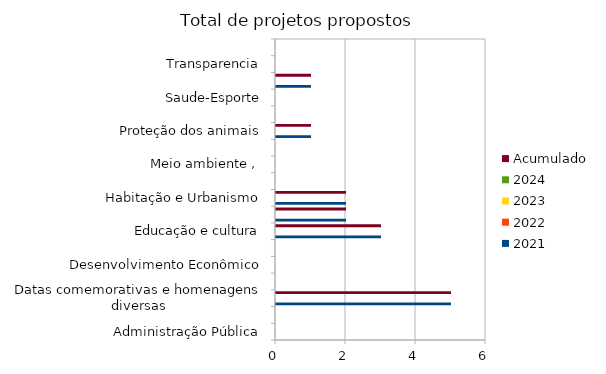
| Category | 2021 | 2022 | 2023 | 2024 | Acumulado |
|---|---|---|---|---|---|
| Administração Pública | 0 |  |  |  | 0 |
| Combate à corrupção  | 0 |  |  |  | 0 |
| Datas comemorativas e homenagens diversas | 5 |  |  |  | 5 |
| Denominação de logradouro | 0 |  |  |  | 0 |
| Desenvolvimento Econômico | 0 |  |  |  | 0 |
| Desenvolvimento Social  | 0 |  |  |  | 0 |
| Educação e cultura | 3 |  |  |  | 3 |
| Frente parlamentar | 2 |  |  |  | 2 |
| Habitação e Urbanismo | 2 |  |  |  | 2 |
| Lei Orgânica do Município | 0 |  |  |  | 0 |
| Meio ambiente ,  | 0 |  |  |  | 0 |
| Mobilidade | 0 |  |  |  | 0 |
| Proteção dos animais | 1 |  |  |  | 1 |
| Regimento Interno da CMSP | 0 |  |  |  | 0 |
| Saude-Esporte | 0 |  |  |  | 0 |
| Segurança Pública | 1 |  |  |  | 1 |
| Transparencia | 0 |  |  |  | 0 |
| Tributação | 0 |  |  |  | 0 |